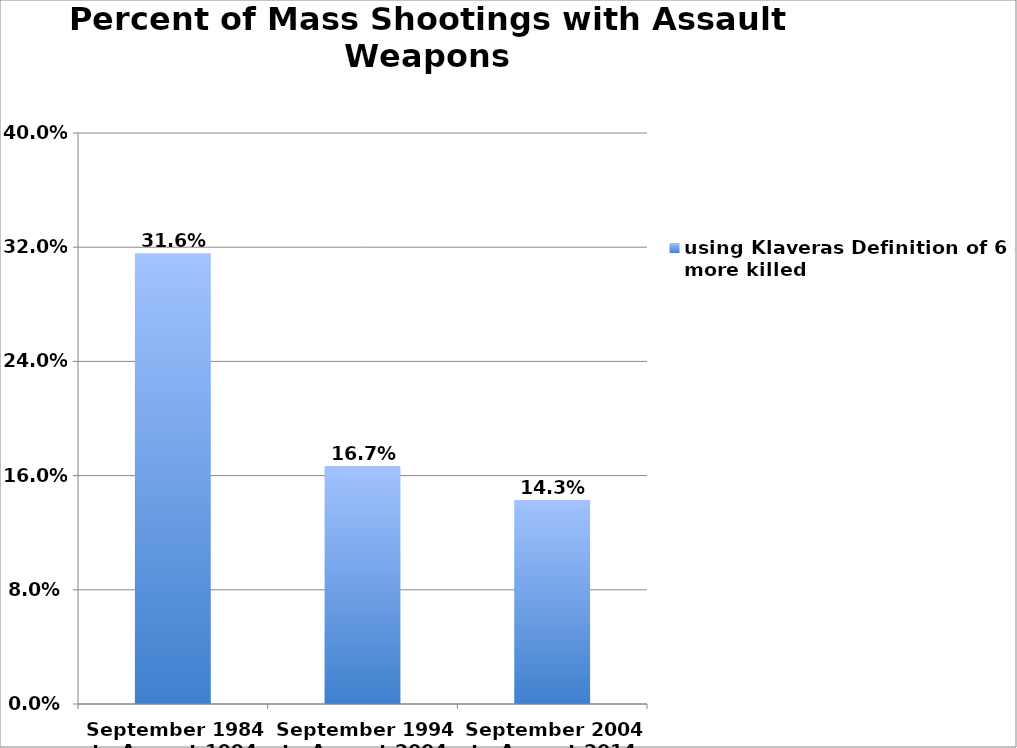
| Category | using Klaveras Definition of 6 or more killed |
|---|---|
| September 1984 to August 1994 | 0.316 |
| September 1994 to August 2004 | 0.167 |
| September 2004 to August 2014 | 0.143 |